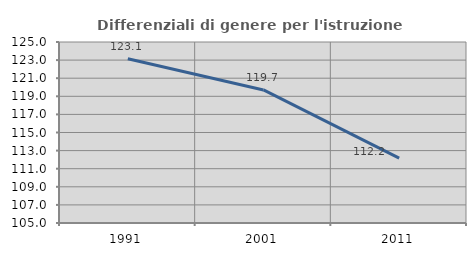
| Category | Differenziali di genere per l'istruzione superiore |
|---|---|
| 1991.0 | 123.147 |
| 2001.0 | 119.705 |
| 2011.0 | 112.171 |